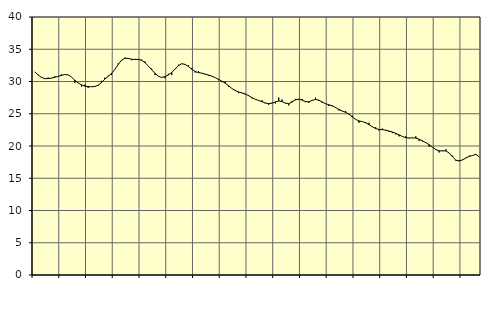
| Category | Piggar | Series 1 |
|---|---|---|
| nan | 31.5 | 31.5 |
| 87.0 | 31 | 31.04 |
| 87.0 | 30.7 | 30.64 |
| 87.0 | 30.4 | 30.44 |
| nan | 30.6 | 30.45 |
| 88.0 | 30.5 | 30.53 |
| 88.0 | 30.8 | 30.64 |
| 88.0 | 30.8 | 30.79 |
| nan | 31.1 | 30.95 |
| 89.0 | 31.1 | 31.08 |
| 89.0 | 31 | 31.03 |
| 89.0 | 30.7 | 30.7 |
| nan | 29.8 | 30.2 |
| 90.0 | 29.8 | 29.77 |
| 90.0 | 29.2 | 29.48 |
| 90.0 | 29.5 | 29.29 |
| nan | 29 | 29.21 |
| 91.0 | 29.2 | 29.19 |
| 91.0 | 29.3 | 29.22 |
| 91.0 | 29.3 | 29.42 |
| nan | 30.1 | 29.86 |
| 92.0 | 30.6 | 30.38 |
| 92.0 | 30.9 | 30.8 |
| 92.0 | 31 | 31.25 |
| nan | 31.9 | 31.88 |
| 93.0 | 32.8 | 32.66 |
| 93.0 | 33.2 | 33.31 |
| 93.0 | 33.7 | 33.61 |
| nan | 33.5 | 33.58 |
| 94.0 | 33.3 | 33.45 |
| 94.0 | 33.5 | 33.42 |
| 94.0 | 33.5 | 33.43 |
| nan | 33.4 | 33.28 |
| 95.0 | 33.1 | 32.92 |
| 95.0 | 32.4 | 32.41 |
| 95.0 | 32 | 31.82 |
| nan | 31 | 31.26 |
| 96.0 | 30.8 | 30.81 |
| 96.0 | 30.6 | 30.63 |
| 96.0 | 30.5 | 30.77 |
| nan | 31.2 | 31.03 |
| 97.0 | 31 | 31.4 |
| 97.0 | 31.9 | 31.92 |
| 97.0 | 32.6 | 32.46 |
| nan | 32.8 | 32.76 |
| 98.0 | 32.6 | 32.65 |
| 98.0 | 32.5 | 32.32 |
| 98.0 | 32.1 | 31.91 |
| nan | 31.4 | 31.55 |
| 99.0 | 31.6 | 31.38 |
| 99.0 | 31.3 | 31.29 |
| 99.0 | 31.1 | 31.15 |
| nan | 30.9 | 30.99 |
| 0.0 | 30.8 | 30.83 |
| 0.0 | 30.6 | 30.6 |
| 0.0 | 30.2 | 30.33 |
| nan | 29.9 | 30.06 |
| 1.0 | 30 | 29.74 |
| 1.0 | 29.2 | 29.34 |
| 1.0 | 28.9 | 28.91 |
| nan | 28.7 | 28.59 |
| 2.0 | 28.2 | 28.38 |
| 2.0 | 28.2 | 28.23 |
| 2.0 | 28 | 28.07 |
| nan | 27.9 | 27.8 |
| 3.0 | 27.4 | 27.49 |
| 3.0 | 27.2 | 27.24 |
| 3.0 | 27.1 | 27.06 |
| nan | 27.1 | 26.86 |
| 4.0 | 26.6 | 26.67 |
| 4.0 | 26.4 | 26.57 |
| 4.0 | 26.7 | 26.64 |
| nan | 26.6 | 26.84 |
| 5.0 | 27.5 | 26.98 |
| 5.0 | 27.2 | 26.89 |
| 5.0 | 26.6 | 26.64 |
| nan | 26.3 | 26.58 |
| 6.0 | 27 | 26.82 |
| 6.0 | 27.3 | 27.15 |
| 6.0 | 27.3 | 27.26 |
| nan | 27.3 | 27.11 |
| 7.0 | 26.8 | 26.88 |
| 7.0 | 26.7 | 26.85 |
| 7.0 | 27 | 27.07 |
| nan | 27.5 | 27.23 |
| 8.0 | 27 | 27.11 |
| 8.0 | 26.7 | 26.82 |
| 8.0 | 26.6 | 26.56 |
| nan | 26.2 | 26.39 |
| 9.0 | 26.3 | 26.22 |
| 9.0 | 26 | 25.96 |
| 9.0 | 25.5 | 25.67 |
| nan | 25.4 | 25.42 |
| 10.0 | 25.4 | 25.22 |
| 10.0 | 24.9 | 24.94 |
| 10.0 | 24.7 | 24.51 |
| nan | 24.1 | 24.12 |
| 11.0 | 23.6 | 23.89 |
| 11.0 | 23.8 | 23.78 |
| 11.0 | 23.7 | 23.6 |
| nan | 23.6 | 23.31 |
| 12.0 | 23 | 22.97 |
| 12.0 | 22.9 | 22.7 |
| 12.0 | 22.4 | 22.57 |
| nan | 22.7 | 22.53 |
| 13.0 | 22.5 | 22.45 |
| 13.0 | 22.2 | 22.32 |
| 13.0 | 22 | 22.16 |
| nan | 21.8 | 21.97 |
| 14.0 | 21.5 | 21.72 |
| 14.0 | 21.5 | 21.48 |
| 14.0 | 21.5 | 21.29 |
| nan | 21.2 | 21.23 |
| 15.0 | 21.3 | 21.26 |
| 15.0 | 21.5 | 21.23 |
| 15.0 | 20.8 | 21.05 |
| nan | 20.7 | 20.8 |
| 16.0 | 20.6 | 20.52 |
| 16.0 | 19.9 | 20.2 |
| 16.0 | 19.8 | 19.81 |
| nan | 19.5 | 19.44 |
| 17.0 | 19 | 19.25 |
| 17.0 | 19.3 | 19.24 |
| 17.0 | 19.5 | 19.24 |
| nan | 18.9 | 18.91 |
| 18.0 | 18.5 | 18.31 |
| 18.0 | 17.7 | 17.8 |
| 18.0 | 17.8 | 17.66 |
| nan | 17.9 | 17.85 |
| 19.0 | 18.2 | 18.15 |
| 19.0 | 18.5 | 18.4 |
| 19.0 | 18.5 | 18.53 |
| nan | 18.7 | 18.71 |
| 20.0 | 18.3 | 18.3 |